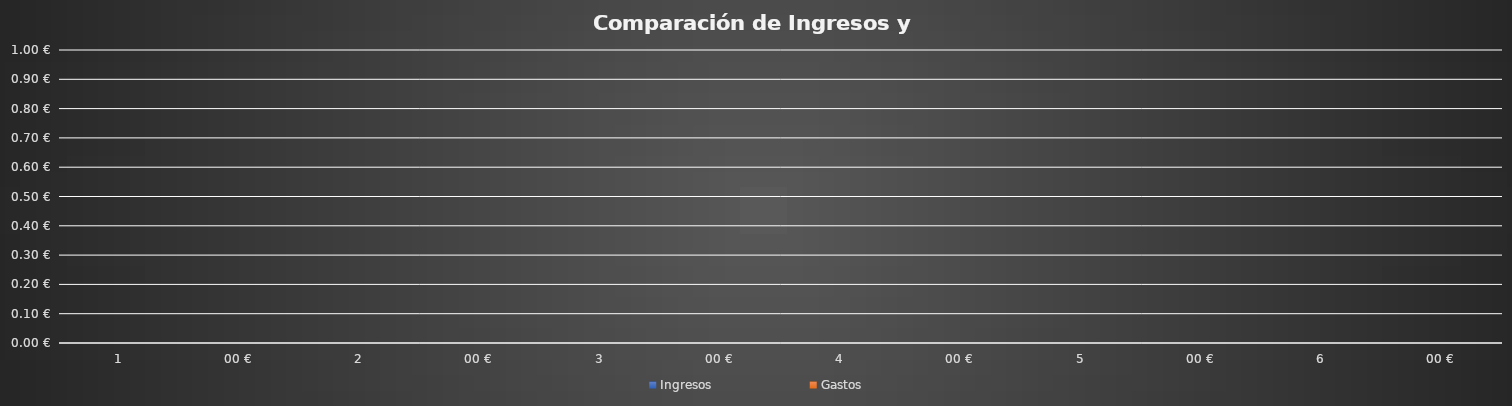
| Category | Ingresos | Gastos |
|---|---|---|
| 0 | 0 | 0 |
| 1 | 0 | 0 |
| 2 | 0 | 0 |
| 3 | 0 | 0 |
| 4 | 0 | 0 |
| 5 | 0 | 0 |
| 6 | 0 | 0 |
| 7 | 0 | 0 |
| 8 | 0 | 0 |
| 9 | 0 | 0 |
| 10 | 0 | 0 |
| 11 | 0 | 0 |